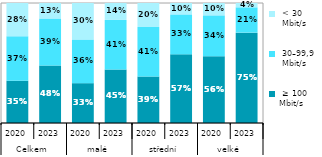
| Category |  ≥ 100 
Mbit/s  |  30–99,9 
 Mbit/s |  < 30 
 Mbit/s |
|---|---|---|---|
| 0 | 0.351 | 0.371 | 0.277 |
| 1 | 0.48 | 0.391 | 0.129 |
| 2 | 0.332 | 0.364 | 0.304 |
| 3 | 0.446 | 0.413 | 0.141 |
| 4 | 0.388 | 0.412 | 0.2 |
| 5 | 0.572 | 0.333 | 0.095 |
| 6 | 0.556 | 0.341 | 0.103 |
| 7 | 0.753 | 0.211 | 0.036 |